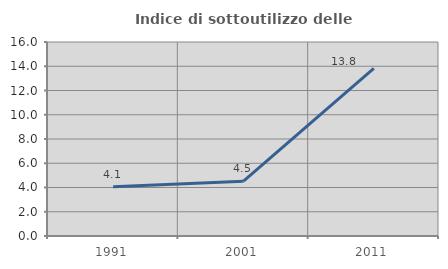
| Category | Indice di sottoutilizzo delle abitazioni  |
|---|---|
| 1991.0 | 4.066 |
| 2001.0 | 4.517 |
| 2011.0 | 13.824 |